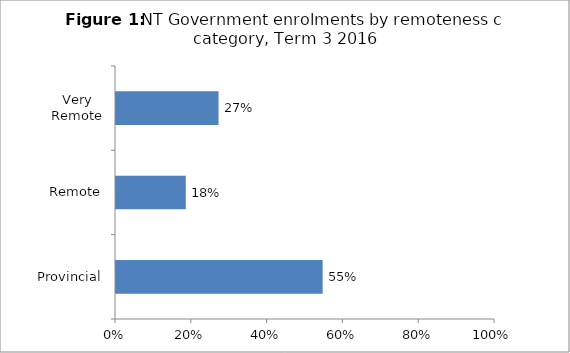
| Category | % |
|---|---|
| Provincial | 0.545 |
| Remote | 0.184 |
| Very Remote | 0.271 |